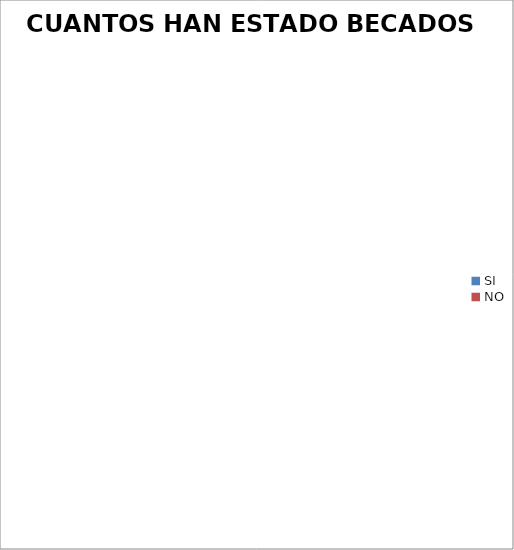
| Category | Becado |
|---|---|
| SI | 0 |
| NO | 0 |